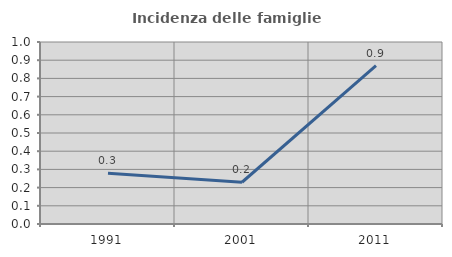
| Category | Incidenza delle famiglie numerose |
|---|---|
| 1991.0 | 0.279 |
| 2001.0 | 0.229 |
| 2011.0 | 0.87 |